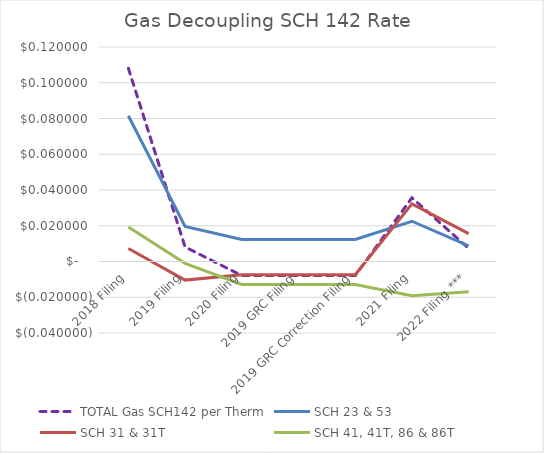
| Category | TOTAL Gas SCH142 per Therm | SCH 23 & 53 | SCH 31 & 31T | SCH 41, 41T, 86 & 86T |
|---|---|---|---|---|
| 2018 Filing | 0.108 | 0.082 | 0.007 | 0.019 |
| 2019 Filing | 0.008 | 0.02 | -0.01 | -0.001 |
| 2020 Filing | -0.008 | 0.012 | -0.007 | -0.013 |
| 2019 GRC Filing | -0.008 | 0.012 | -0.007 | -0.013 |
| 2019 GRC Correction Filing | -0.008 | 0.012 | -0.007 | -0.013 |
| 2021 Filing | 0.036 | 0.023 | 0.032 | -0.019 |
| 2022 Filing *** | 0.007 | 0.009 | 0.016 | -0.017 |